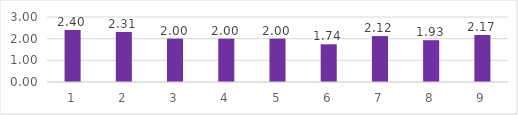
| Category | Series 0 |
|---|---|
| 0 | 2.4 |
| 1 | 2.31 |
| 2 | 2 |
| 3 | 2 |
| 4 | 2 |
| 5 | 1.74 |
| 6 | 2.12 |
| 7 | 1.93 |
| 8 | 2.17 |